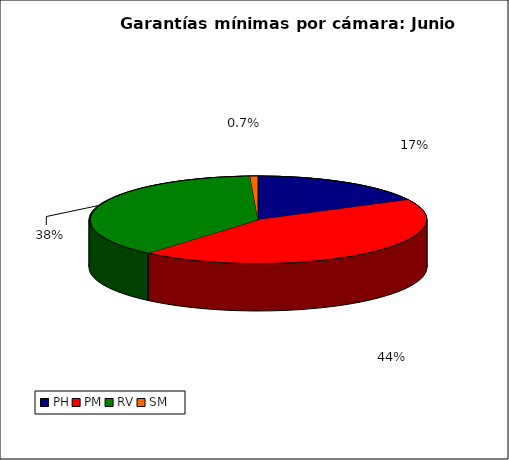
| Category | Series 0 |
|---|---|
| PH | 1959.002 |
| PM | 4908.254 |
| RV | 4262.133 |
| SM | 83.105 |